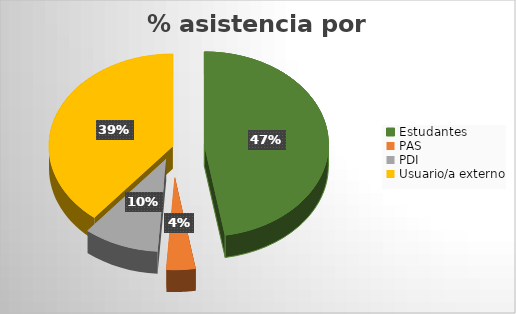
| Category | Series 0 |
|---|---|
| Estudantes | 714 |
| PAS | 57 |
| PDI | 148 |
| Usuario/a externo | 590 |